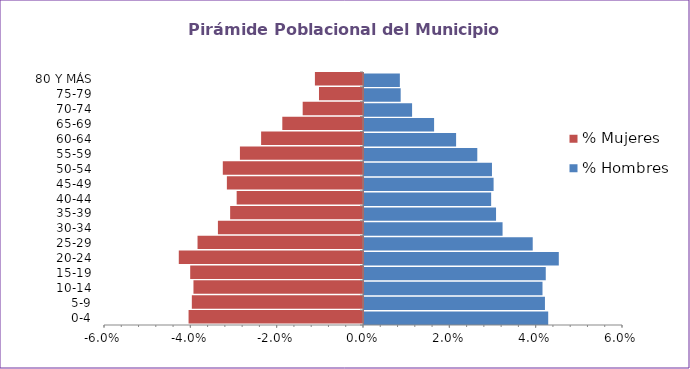
| Category | % Hombres | % Mujeres |
|---|---|---|
| 0-4 | 0.043 | -0.04 |
| 5-9 | 0.042 | -0.04 |
| 10-14 | 0.041 | -0.039 |
| 15-19 | 0.042 | -0.04 |
| 20-24 | 0.045 | -0.043 |
| 25-29 | 0.039 | -0.038 |
| 30-34 | 0.032 | -0.034 |
| 35-39 | 0.031 | -0.031 |
| 40-44 | 0.029 | -0.029 |
| 45-49 | 0.03 | -0.032 |
| 50-54 | 0.03 | -0.032 |
| 55-59 | 0.026 | -0.029 |
| 60-64 | 0.021 | -0.024 |
| 65-69 | 0.016 | -0.019 |
| 70-74 | 0.011 | -0.014 |
| 75-79 | 0.008 | -0.01 |
| 80 Y MÁS | 0.008 | -0.011 |